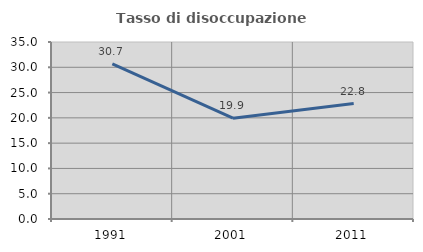
| Category | Tasso di disoccupazione giovanile  |
|---|---|
| 1991.0 | 30.655 |
| 2001.0 | 19.945 |
| 2011.0 | 22.817 |